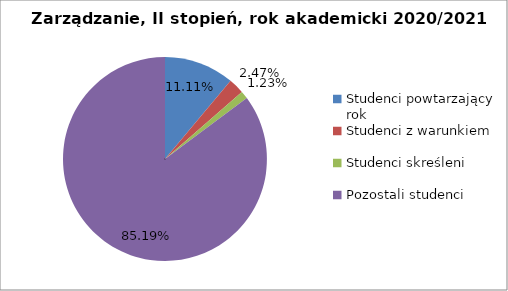
| Category | Series 0 |
|---|---|
| Studenci powtarzający rok | 9 |
| Studenci z warunkiem | 2 |
| Studenci skreśleni | 1 |
| Pozostali studenci | 69 |